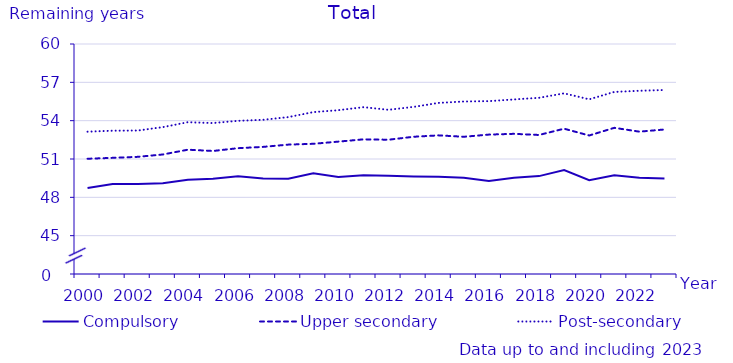
| Category | Compulsory | Upper secondary | Post-secondary |
|---|---|---|---|
| 2000.0 | 48.731 | 51.02 | 53.137 |
| 2001.0 | 49.05 | 51.09 | 53.215 |
| 2002.0 | 49.047 | 51.169 | 53.227 |
| 2003.0 | 49.095 | 51.354 | 53.494 |
| 2004.0 | 49.374 | 51.728 | 53.879 |
| 2005.0 | 49.45 | 51.628 | 53.812 |
| 2006.0 | 49.641 | 51.846 | 53.988 |
| 2007.0 | 49.465 | 51.948 | 54.069 |
| 2008.0 | 49.458 | 52.125 | 54.278 |
| 2009.0 | 49.886 | 52.189 | 54.669 |
| 2010.0 | 49.592 | 52.36 | 54.819 |
| 2011.0 | 49.723 | 52.538 | 55.057 |
| 2012.0 | 49.68 | 52.51 | 54.85 |
| 2013.0 | 49.63 | 52.74 | 55.08 |
| 2014.0 | 49.61 | 52.85 | 55.39 |
| 2015.0 | 49.54 | 52.74 | 55.5 |
| 2016.0 | 49.27 | 52.91 | 55.53 |
| 2017.0 | 49.53 | 52.97 | 55.66 |
| 2018.0 | 49.66 | 52.88 | 55.79 |
| 2019.0 | 50.14 | 53.37 | 56.14 |
| 2020.0 | 49.34 | 52.84 | 55.67 |
| 2021.0 | 49.72 | 53.44 | 56.25 |
| 2022.0 | 49.53 | 53.14 | 56.34 |
| 2023.0 | 49.47 | 53.31 | 56.4 |